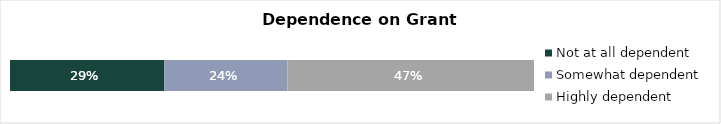
| Category | Not at all dependent | Somewhat dependent | Highly dependent |
|---|---|---|---|
| Total | 0.294 | 0.235 | 0.471 |